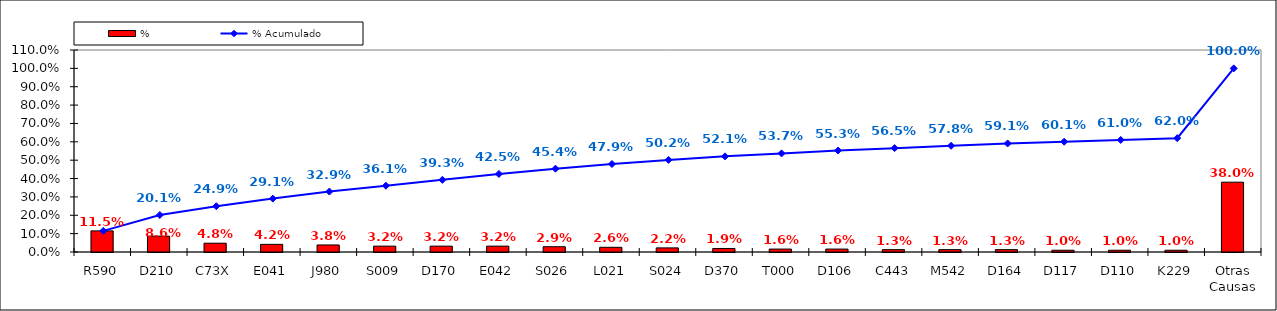
| Category | % |
|---|---|
| R590 | 0.115 |
| D210 | 0.086 |
| C73X | 0.048 |
| E041 | 0.042 |
| J980 | 0.038 |
| S009 | 0.032 |
| D170 | 0.032 |
| E042 | 0.032 |
| S026 | 0.029 |
| L021 | 0.026 |
| S024 | 0.022 |
| D370 | 0.019 |
| T000 | 0.016 |
| D106 | 0.016 |
| C443 | 0.013 |
| M542 | 0.013 |
| D164 | 0.013 |
| D117 | 0.01 |
| D110 | 0.01 |
| K229 | 0.01 |
| Otras Causas | 0.38 |